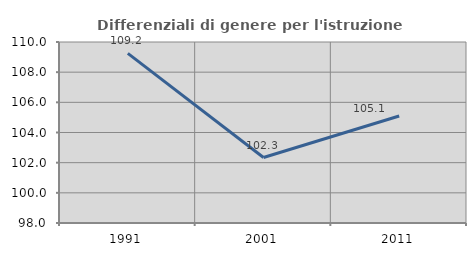
| Category | Differenziali di genere per l'istruzione superiore |
|---|---|
| 1991.0 | 109.25 |
| 2001.0 | 102.342 |
| 2011.0 | 105.096 |